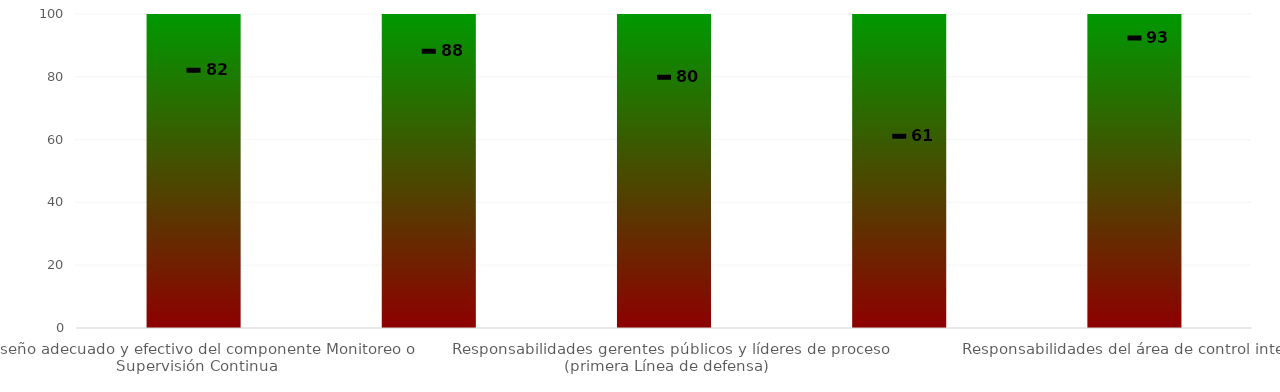
| Category | Niveles |
|---|---|
| Diseño adecuado y efectivo del componente Monitoreo o Supervisión Continua | 100 |
| Responsabilidades de la Alta dirección y Comité Institucional de Coordinación de Control Interno (línea estratégica) | 100 |
| Responsabilidades gerentes públicos y líderes de proceso (primera Línea de defensa) | 100 |
| Responsabilidades de los servidores encargados del monitoreo y evaluación de controles y gestión del riesgo (segunda línea de defensa) | 100 |
| Responsabilidades del área de control interno | 100 |